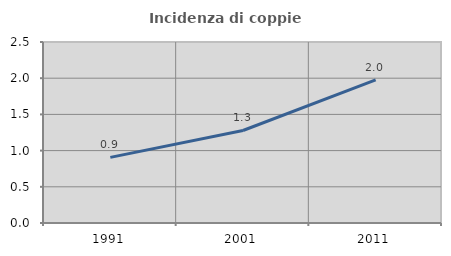
| Category | Incidenza di coppie miste |
|---|---|
| 1991.0 | 0.906 |
| 2001.0 | 1.278 |
| 2011.0 | 1.976 |